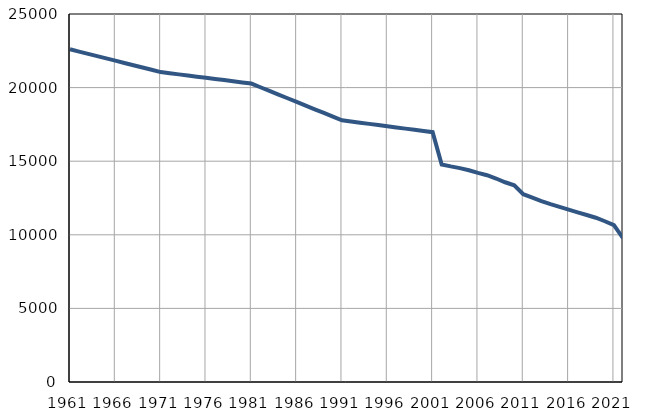
| Category | Број
становника |
|---|---|
| 1961.0 | 22602 |
| 1962.0 | 22447 |
| 1963.0 | 22292 |
| 1964.0 | 22138 |
| 1965.0 | 21983 |
| 1966.0 | 21829 |
| 1967.0 | 21674 |
| 1968.0 | 21519 |
| 1969.0 | 21364 |
| 1970.0 | 21210 |
| 1971.0 | 21055 |
| 1972.0 | 20977 |
| 1973.0 | 20899 |
| 1974.0 | 20821 |
| 1975.0 | 20743 |
| 1976.0 | 20665 |
| 1977.0 | 20587 |
| 1978.0 | 20509 |
| 1979.0 | 20431 |
| 1980.0 | 20353 |
| 1981.0 | 20275 |
| 1982.0 | 20025 |
| 1983.0 | 19775 |
| 1984.0 | 19526 |
| 1985.0 | 19276 |
| 1986.0 | 19026 |
| 1987.0 | 18776 |
| 1988.0 | 18526 |
| 1989.0 | 18277 |
| 1990.0 | 18027 |
| 1991.0 | 17777 |
| 1992.0 | 17697 |
| 1993.0 | 17616 |
| 1994.0 | 17536 |
| 1995.0 | 17455 |
| 1996.0 | 17375 |
| 1997.0 | 17294 |
| 1998.0 | 17214 |
| 1999.0 | 17133 |
| 2000.0 | 17053 |
| 2001.0 | 16972 |
| 2002.0 | 14780 |
| 2003.0 | 14648 |
| 2004.0 | 14532 |
| 2005.0 | 14382 |
| 2006.0 | 14205 |
| 2007.0 | 14047 |
| 2008.0 | 13825 |
| 2009.0 | 13569 |
| 2010.0 | 13359 |
| 2011.0 | 12756 |
| 2012.0 | 12525 |
| 2013.0 | 12292 |
| 2014.0 | 12084 |
| 2015.0 | 11899 |
| 2016.0 | 11708 |
| 2017.0 | 11528 |
| 2018.0 | 11348 |
| 2019.0 | 11159 |
| 2020.0 | 10920 |
| 2021.0 | 10653 |
| 2022.0 | 9771 |